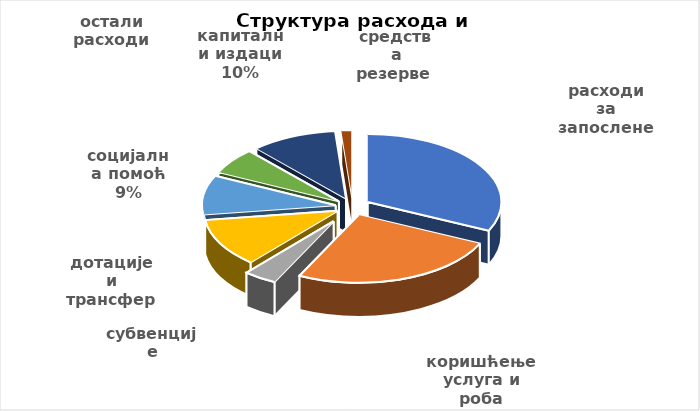
| Category | Series 0 |
|---|---|
| расходи за запослене | 60913000 |
| коришћење услуга и роба | 48275000 |
| субвенције | 7600000 |
| дотације и трансфери | 21950000 |
| социјална помоћ | 17743000 |
| остали расходи | 11772000 |
| капитални издаци | 19790000 |
| средства резерве  | 2500000 |